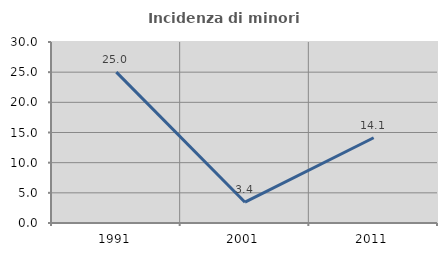
| Category | Incidenza di minori stranieri |
|---|---|
| 1991.0 | 25 |
| 2001.0 | 3.448 |
| 2011.0 | 14.13 |